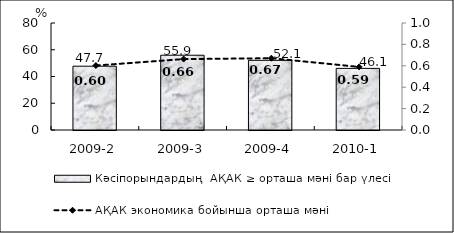
| Category | Кәсіпорындардың  АҚАК ≥ орташа мәні бар үлесі  |
|---|---|
| 2009-2 | 47.71 |
| 2009-3 | 55.9 |
| 2009-4 | 52.1 |
| 2010-1 | 46.07 |